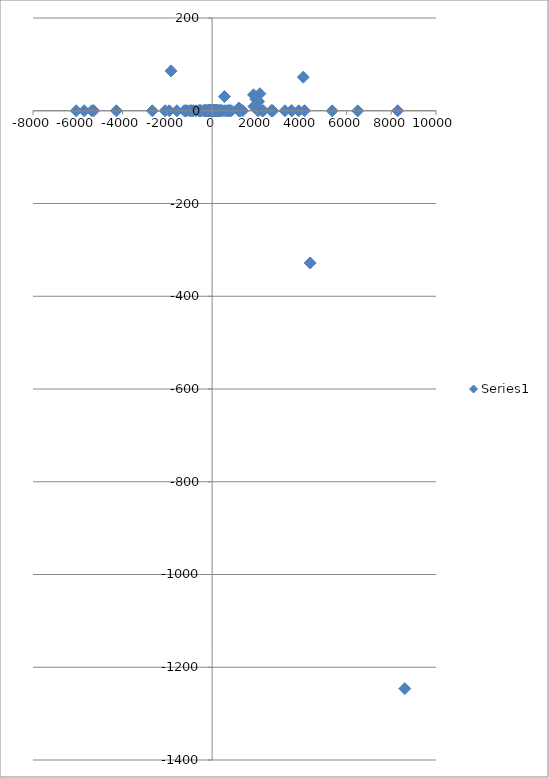
| Category | Series 0 |
|---|---|
| 7.646657745856281 | -0.001 |
| 10.78995867613807 | 0 |
| 28.41476915901675 | 0 |
| -3.391862608465674 | 0 |
| -24.03185155917303 | 0.001 |
| -1.065310290781972 | 0 |
| 19.72317522117446 | 0 |
| 33.3229442908123 | 0.001 |
| 56.57212469356857 | 0 |
| 66.83839825908281 | -0.001 |
| -15.47737759910624 | 0 |
| -0.240951311865627 | 0 |
| 17.74387371059588 | 0 |
| 46.82567975016776 | 0 |
| 60.83113892583912 | 0 |
| 86.4916275696548 | 0 |
| 35.44741770634049 | 0 |
| -5.579011385079787 | 0 |
| 9.190034674890027 | 0.001 |
| -2.392685398023335 | 0.001 |
| 28.22428907907219 | -0.001 |
| 67.65676897245426 | 0 |
| 52.82680652660252 | -0.001 |
| 35.74249598048167 | 0.001 |
| 15.50531006955876 | 0 |
| -11.86280086153149 | 0 |
| -25.56059111749991 | 0 |
| 74.96021270244094 | 0 |
| 64.57049807345246 | 0 |
| 21.92776250130038 | -0.001 |
| 25.50905330575646 | 0 |
| 0.620016197052798 | 0 |
| -34.60348783762679 | 0.001 |
| 2.226137174143931 | 0 |
| -5.790196849479245 | 0 |
| -25.95933768285294 | 0.001 |
| -26.27567729341575 | 0 |
| -44.71276926693524 | 0 |
| -50.75077976138036 | 0 |
| -57.46182236792565 | 0 |
| -58.20857191671654 | 0 |
| -42.88590519434574 | 0.001 |
| -46.13511078182418 | 0 |
| -59.9743387747495 | 0 |
| -66.42052338463581 | 0 |
| -41.7676339285939 | 0 |
| -74.1963239949363 | 0 |
| -68.54627003574385 | 0 |
| -53.51969612042218 | 0 |
| -43.9355942877808 | 0 |
| -85.13440861848521 | 0 |
| -92.96901285289302 | 0.001 |
| -101.9648368629164 | 0 |
| -96.65412508273361 | 0.001 |
| -96.71926787238641 | -0.001 |
| -88.29022922462681 | 0 |
| -114.4067106196266 | 0 |
| -125.9985378963393 | 0 |
| -116.2228912060109 | 0 |
| -142.4552364768523 | 0 |
| -141.5462123023933 | 0 |
| -108.5404060914714 | 0 |
| -122.6067708857597 | 0 |
| -106.998305257162 | 0.001 |
| 103.5715873837928 | 0 |
| 103.7095626990137 | 0 |
| 22.29677913733218 | 0 |
| 69.23582576576625 | 0 |
| -69.06984555917944 | 0 |
| -42.46823002803525 | 0 |
| 137.7899820129643 | 0 |
| 120.4390771267102 | 0 |
| -4.288936302212212 | 0.001 |
| -127.5928997891164 | 0 |
| 201.3332117997 | 0 |
| -181.6859376779708 | 0.001 |
| 63.47818478330833 | 0 |
| 93.44030556679365 | -0.001 |
| -219.2707856519308 | -0.001 |
| 239.8054124419643 | 0.001 |
| -141.8162694714247 | -0.001 |
| -39.94240545733284 | -0.001 |
| 212.8152639517515 | 0 |
| -295.2885443159749 | 0 |
| 228.8136290588047 | -0.001 |
| -43.4606061533095 | 0 |
| -163.0688394926397 | 0 |
| 293.0053335127467 | 0 |
| -355.0435200444221 | 0 |
| 148.8255162726775 | 0 |
| 116.2758602630989 | 0 |
| -346.6965620359444 | -0.001 |
| 414.9817674125652 | 0 |
| -283.7251765251853 | 0.001 |
| -21.08716259053845 | 0 |
| 378.256702583636 | 0 |
| -494.0546199137685 | -0.001 |
| 423.7157460006863 | 0 |
| -95.06702494961186 | 0 |
| -252.376997843838 | 0 |
| 537.8643598761482 | 0 |
| -586.0306745885598 | 0 |
| 316.5514811204617 | 0 |
| 208.5195652806414 | 0 |
| -490.4434104830041 | 0 |
| 787.527016852363 | 0 |
| -565.101770716386 | 0 |
| 68.022025576154 | 0 |
| 405.9481839107959 | 0 |
| -829.9628148563454 | 0.001 |
| 767.955384244843 | 0 |
| -286.7936818413867 | 0 |
| -323.4583249062391 | 0.001 |
| 857.2244376368545 | 0 |
| -927.1465098988407 | 0 |
| 638.2386057369515 | 0 |
| 115.5356115785992 | 0 |
| -902.2035092475877 | 0 |
| 1196.620358678289 | 0.001 |
| -1006.264605161975 | 0 |
| 265.120832009602 | 0 |
| 730.3959889227523 | 0 |
| -1241.695655536925 | 0 |
| 1366.523896771715 | 0 |
| -713.266984930697 | 0 |
| -359.5122975279511 | 0.001 |
| 1260.112692998258 | 0 |
| -1573.373416940489 | 0.001 |
| 1236.300993425207 | 0.001 |
| -100.241480047488 | 0 |
| -1169.2994209067 | 0 |
| 2049.586031578475 | 0 |
| -1139.852142192655 | -0.001 |
| -548.399629848654 | -0.001 |
| 352.939019317668 | -0.001 |
| 291.6252053957766 | 0 |
| 160.5842592096439 | 0 |
| -200.2305382003945 | 0 |
| 550.9615647795698 | 30.617 |
| 1849.946562809968 | 34.427 |
| 1201.382974562277 | 5.992 |
| 1866.687596941817 | 9.302 |
| 1957.776929592261 | 24.822 |
| 2077.291923057566 | 19.997 |
| 2132.996822439256 | 36.834 |
| 4126.139284200626 | 0.115 |
| 4072.129625730887 | 72.423 |
| 3545.737654758261 | 0.143 |
| -2671.868737794925 | -0.036 |
| -4275.530349025941 | -0.048 |
| -5286.628977361316 | 0.157 |
| -2099.451027721927 | 0.015 |
| -6070.16538997805 | -0.007 |
| -1911.633388976194 | -0.067 |
| -1835.160136064758 | 85.918 |
| -5372.212190554092 | 0.079 |
| -5713.76880454043 | 0.127 |
| 2225.928123088796 | 0.115 |
| 2282.859050500561 | 0.063 |
| 2641.815217192043 | 0.075 |
| 2666.638577936055 | 0.027 |
| 2709.99588689309 | 0 |
| 3253.940711255175 | -0.042 |
| 3559.810963155094 | -0.073 |
| 3866.209990072044 | -0.091 |
| 4379.905629026663 | -328.15 |
| 5364.516327335771 | -0.146 |
| 6501.369947408395 | -0.196 |
| 8287.930514555504 | -0.017 |
| 8607.029432630958 | -1246.051 |
| 155.5405058710782 | 0 |
| 151.5796888191462 | 0.001 |
| 145.9629955268796 | 0 |
| 150.777935737161 | 0 |
| 159.6977597872701 | 0 |
| 145.6823771797979 | 0 |
| 160.3895201404748 | 0 |
| 165.089383943219 | -0.001 |
| 165.1050117428767 | 0 |
| 137.2132702140137 | 0.001 |
| 133.0158385805932 | 0 |
| 142.4192364149275 | 0 |
| 168.466333772036 | -0.001 |
| 173.1667295833747 | -0.001 |
| 173.1923846640314 | 0 |
| 129.1160181093616 | 0.001 |
| 125.2250284170456 | -0.001 |
| 134.4455356490289 | 0 |
| 178.2504006013806 | 0 |
| 118.7356353034708 | 0 |
| 125.3087267839576 | 0.001 |
| 180.8653748786265 | 0 |
| 720.398883579465 | 0 |